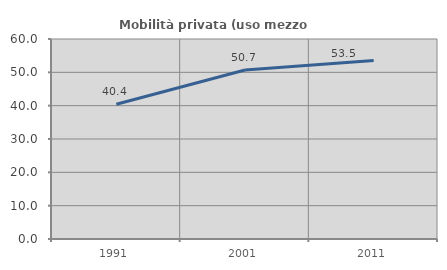
| Category | Mobilità privata (uso mezzo privato) |
|---|---|
| 1991.0 | 40.417 |
| 2001.0 | 50.705 |
| 2011.0 | 53.534 |